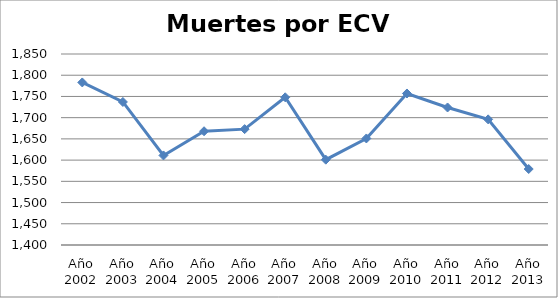
| Category | Series 0 |
|---|---|
| Año 2002 | 1783 |
| Año 2003 | 1737 |
| Año 2004 | 1611 |
| Año 2005 | 1668 |
| Año 2006 | 1673 |
| Año 2007 | 1748 |
| Año 2008 | 1601 |
| Año 2009 | 1651 |
| Año 2010 | 1757 |
| Año 2011 | 1724 |
| Año 2012 | 1696 |
| Año 2013 | 1579 |